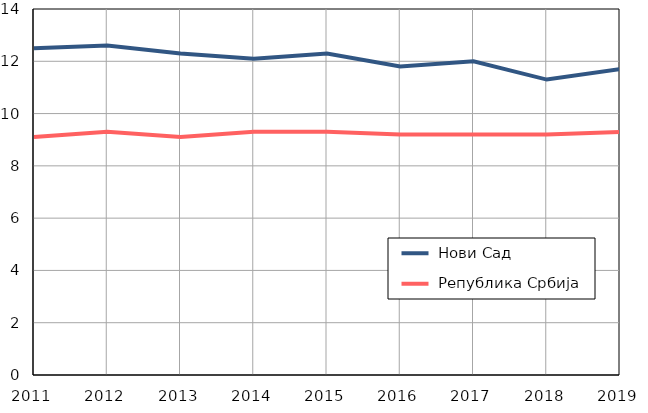
| Category |  Нови Сад |  Република Србија |
|---|---|---|
| 2011.0 | 12.5 | 9.1 |
| 2012.0 | 12.6 | 9.3 |
| 2013.0 | 12.3 | 9.1 |
| 2014.0 | 12.1 | 9.3 |
| 2015.0 | 12.3 | 9.3 |
| 2016.0 | 11.8 | 9.2 |
| 2017.0 | 12 | 9.2 |
| 2018.0 | 11.3 | 9.2 |
| 2019.0 | 11.7 | 9.3 |